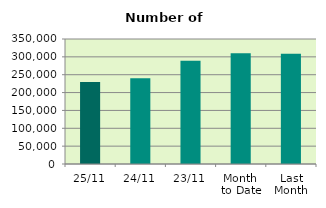
| Category | Series 0 |
|---|---|
| 25/11 | 229326 |
| 24/11 | 240408 |
| 23/11 | 288816 |
| Month 
to Date | 310170.316 |
| Last
Month | 308508.19 |